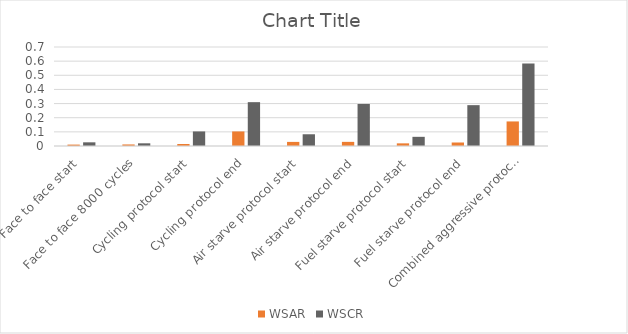
| Category | WSAR | WSCR |
|---|---|---|
| Face to face start | 0.01 | 0.026 |
| Face to face 8000 cycles | 0.011 | 0.019 |
| Cycling protocol start | 0.014 | 0.103 |
| Cycling protocol end | 0.103 | 0.31 |
| Air starve protocol start | 0.029 | 0.083 |
| Air starve protocol end | 0.029 | 0.297 |
| Fuel starve protocol start | 0.019 | 0.065 |
| Fuel starve protocol end | 0.025 | 0.289 |
| Combined aggressive protocol end | 0.174 | 0.583 |